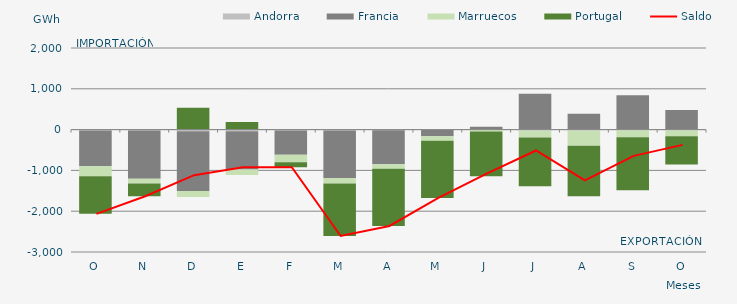
| Category | Andorra | Francia | Marruecos | Portugal |
|---|---|---|---|---|
| O | -20.359 | -877.448 | -247.178 | -920.502 |
| N | -20.176 | -1184.993 | -114.159 | -314.568 |
| D | -39.88 | -1462.427 | -149.967 | 535.045 |
| E | -42.454 | -936.901 | -131.692 | 188.334 |
| F | -21.206 | -592.499 | -187.112 | -122.026 |
| M | -23.108 | -1163.333 | -133.704 | -1286.701 |
| A | -14.627 | -836.505 | -105.478 | -1404.431 |
| M | -10.909 | -149.423 | -115.706 | -1398.852 |
| J | -2.08 | 70.4 | -42.701 | -1096.73 |
| J | -19.231 | 877.054 | -174.716 | -1194.709 |
| A | -19.938 | 386.697 | -376.794 | -1234.348 |
| S | -15.222 | 839.392 | -170.976 | -1297.757 |
| O | -13.493 | 479.877 | -148.522 | -692.604 |